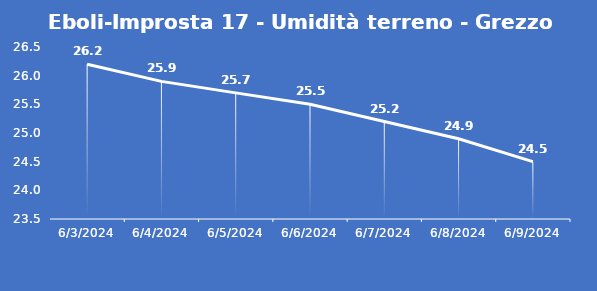
| Category | Eboli-Improsta 17 - Umidità terreno - Grezzo (%VWC) |
|---|---|
| 6/3/24 | 26.2 |
| 6/4/24 | 25.9 |
| 6/5/24 | 25.7 |
| 6/6/24 | 25.5 |
| 6/7/24 | 25.2 |
| 6/8/24 | 24.9 |
| 6/9/24 | 24.5 |